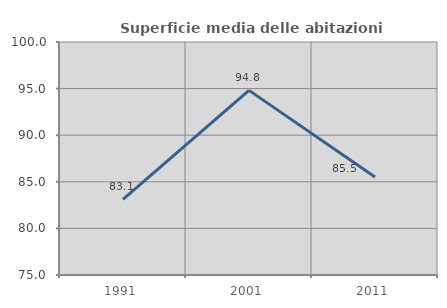
| Category | Superficie media delle abitazioni occupate |
|---|---|
| 1991.0 | 83.104 |
| 2001.0 | 94.81 |
| 2011.0 | 85.515 |